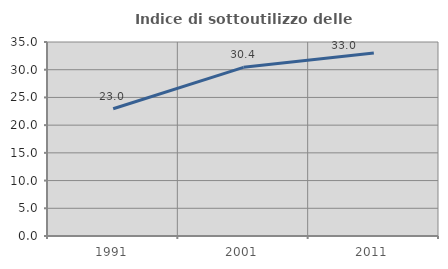
| Category | Indice di sottoutilizzo delle abitazioni  |
|---|---|
| 1991.0 | 22.951 |
| 2001.0 | 30.424 |
| 2011.0 | 33.034 |